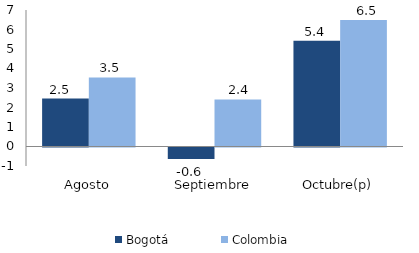
| Category | Bogotá | Colombia |
|---|---|---|
| Agosto | 2.456 | 3.543 |
| Septiembre | -0.584 | 2.416 |
| Octubre(p) | 5.418 | 6.484 |